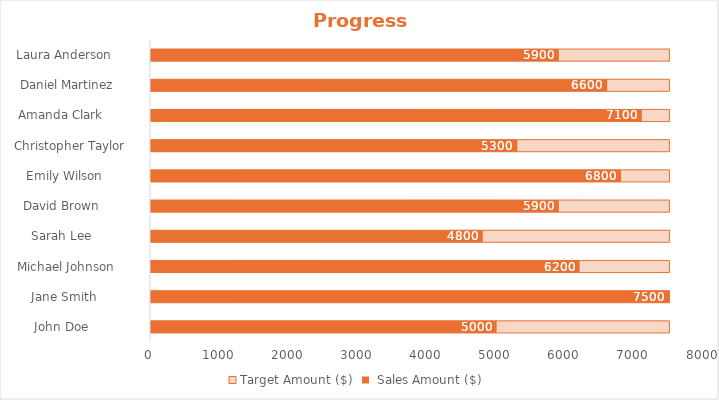
| Category | Target Amount ($) |  Sales Amount ($)  |
|---|---|---|
|  John Doe              | 7500 | 5000 |
|  Jane Smith            | 7500 | 7500 |
|  Michael Johnson       | 7500 | 6200 |
|  Sarah Lee             | 7500 | 4800 |
|  David Brown           | 7500 | 5900 |
|  Emily Wilson          | 7500 | 6800 |
|  Christopher Taylor    | 7500 | 5300 |
|  Amanda Clark          | 7500 | 7100 |
|  Daniel Martinez       | 7500 | 6600 |
|  Laura Anderson        | 7500 | 5900 |